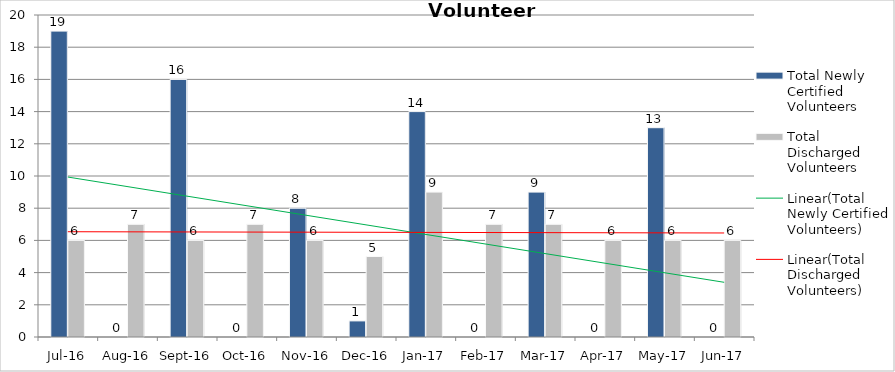
| Category | Total Newly Certified Volunteers | Total Discharged Volunteers |
|---|---|---|
| Jul-16 | 19 | 6 |
| Aug-16 | 0 | 7 |
| Sep-16 | 16 | 6 |
| Oct-16 | 0 | 7 |
| Nov-16 | 8 | 6 |
| Dec-16 | 1 | 5 |
| Jan-17 | 14 | 9 |
| Feb-17 | 0 | 7 |
| Mar-17 | 9 | 7 |
| Apr-17 | 0 | 6 |
| May-17 | 13 | 6 |
| Jun-17 | 0 | 6 |